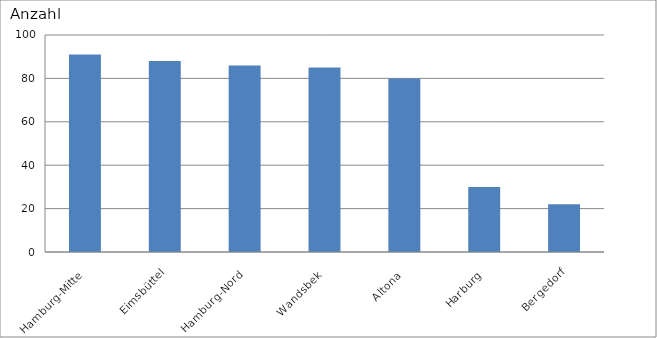
| Category | Hamburg-Mitte |
|---|---|
| Hamburg-Mitte | 91 |
| Eimsbüttel | 88 |
| Hamburg-Nord | 86 |
| Wandsbek | 85 |
| Altona | 80 |
| Harburg | 30 |
| Bergedorf | 22 |